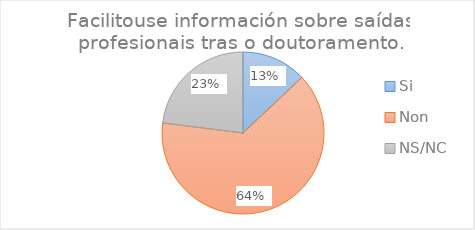
| Category | Series 25 |
|---|---|
| Si | 18 |
| Non | 89 |
| NS/NC | 32 |